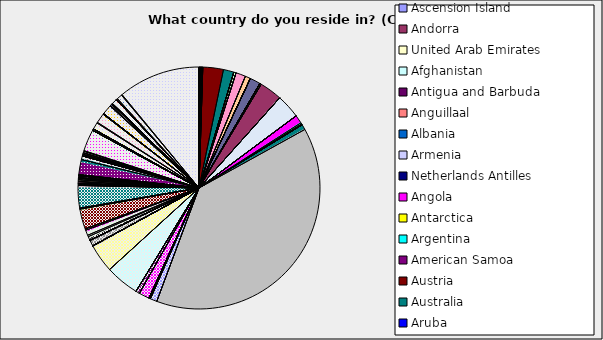
| Category | Series 0 |
|---|---|
| Ascension Island | 0 |
| Andorra | 0 |
| United Arab Emirates | 0 |
| Afghanistan | 0 |
| Antigua and Barbuda | 0 |
| Anguillaal | 0 |
| Albania | 0.001 |
| Armenia | 0 |
| Netherlands Antilles | 0 |
| Angola | 0 |
| Antarctica | 0 |
| Argentina | 0.003 |
| American Samoa | 0 |
| Austria | 0.028 |
| Australia | 0.014 |
| Aruba | 0 |
| Aland Islands | 0 |
| Azerbaijan | 0 |
| Bosnia and Herzegovina | 0.003 |
| Barbados | 0 |
| Bangladesh | 0 |
| Belgium | 0.013 |
| Burkina Faso | 0 |
| Bulgaria | 0.007 |
| Bahrain | 0 |
| Burundi | 0 |
| Benin | 0 |
| Bermuda | 0 |
| Brunei Darussalam | 0 |
| Bolivia | 0 |
| Brazil | 0.014 |
| Bahamas | 0 |
| Bhutan | 0 |
| Bouvet Island | 0 |
| Botswana | 0 |
| Belarus | 0.002 |
| Belize | 0 |
| Canada | 0.03 |
| Cocos (Keeling) Islands | 0 |
| Central African Republic | 0 |
| Congo | 0 |
| Switzerland | 0.032 |
| Cote d'Ivoire | 0 |
| Cook Islands | 0 |
| Chile | 0 |
| Cameroon | 0 |
| China | 0.011 |
| Colombia | 0.002 |
| Costa Rica | 0 |
| Cuba | 0.001 |
| Cape Verde | 0 |
| Christmas Island | 0 |
| Cyprus | 0 |
| Czech Republic | 0.007 |
| Germany | 0.386 |
| Djibouti | 0 |
| Denmark | 0.009 |
| Dominica | 0 |
| Dominican Republic | 0 |
| Algeria | 0.001 |
| Ecuador | 0 |
| Estonia | 0.001 |
| Egypt | 0 |
| Western Sahara | 0 |
| Eritrea | 0 |
| Spain | 0.014 |
| Ethiopia | 0 |
| European Union | 0 |
| Finland | 0.005 |
| Fiji | 0 |
| Falkland Islands (Malvinas) | 0 |
| Micronesia | 0 |
| Faroe Islands | 0 |
| France | 0.045 |
| Gabon | 0 |
| United Kingdom | 0.038 |
| Grenada | 0 |
| Georgia | 0 |
| French Guiana | 0 |
| Guernsey | 0 |
| Ghana | 0 |
| Gibraltar | 0 |
| Greenland | 0 |
| Gambia | 0 |
| Guinea | 0 |
| Guadeloupe | 0 |
| Equatorial Guinea | 0 |
| Greece | 0.008 |
| South Georgia and the South Sandwich Islands | 0 |
| Guatemala | 0 |
| Guam | 0 |
| Guinea-Bissau | 0 |
| Guyana | 0 |
| Hong Kong | 0 |
| Heard and McDonald Islands | 0 |
| Honduras | 0 |
| Croatia/Hrvatska | 0 |
| Haiti | 0 |
| Hungary | 0.005 |
| Indonesia | 0.002 |
| Ireland | 0.007 |
| Israel | 0.002 |
| Isle of Man | 0 |
| India | 0.027 |
| British Indian Ocean Territory | 0 |
| Iraq | 0 |
| Iran | 0.001 |
| Iceland | 0 |
| Italy | 0.03 |
| Jersey | 0 |
| Jamaica | 0.001 |
| Jordan | 0 |
| Japan | 0.001 |
| Kenya | 0 |
| Kyrgyzstan | 0 |
| Cambodia | 0 |
| Kiribati | 0 |
| Comoros | 0 |
| Saint Kitts and Nevis | 0 |
| Korea | 0 |
| Kuwait | 0 |
| Cayman Islands | 0 |
| Kazakhstan | 0 |
| Lao People's Democratic Republic | 0 |
| Lebanon | 0 |
| Saint Lucia | 0 |
| Liechtenstein | 0 |
| Sri Lanka | 0 |
| Liberia | 0 |
| Lesotho | 0 |
| Lithuania | 0.002 |
| Luxembourg | 0.001 |
| Latvia | 0.002 |
| Libyan Arab Jamahiriya | 0 |
| Morocco | 0.002 |
| Monaco | 0 |
| Moldova | 0 |
| Montenegro | 0 |
| Madagascar | 0 |
| Marshall Islands | 0 |
| Macedonia | 0 |
| Mali | 0 |
| Myanmar | 0 |
| Mongolia | 0 |
| Macao | 0 |
| Northern Mariana Islands | 0 |
| Martinique | 0 |
| Mauritania | 0 |
| Montserrat | 0 |
| Malta | 0 |
| Mauritius | 0 |
| Maldives | 0 |
| Malawi | 0 |
| Mexico | 0.002 |
| Malaysia | 0.001 |
| Mozambique | 0 |
| Namibia | 0 |
| New Caledonia | 0 |
| Niger | 0 |
| Norfolk Island | 0 |
| Nigeria | 0.001 |
| Nicaragua | 0 |
| Netherlands | 0.02 |
| Norway | 0.005 |
| Nepal | 0 |
| Nauru | 0 |
| Niue | 0 |
| New Zealand | 0.002 |
| Oman | 0 |
| Panama | 0 |
| Peru | 0.002 |
| French Polynesia | 0 |
| Papua New Guinea | 0 |
| Philippines | 0.002 |
| Pakistan | 0.001 |
| Poland | 0.029 |
| Saint Pierre and Miquelon | 0 |
| Pitcairn Island | 0 |
| Puerto Rico | 0 |
| Palestinian Territory | 0 |
| Portugal | 0.002 |
| Palau | 0 |
| Paraguay | 0 |
| Qatar | 0 |
| Reunion Island | 0 |
| Romania | 0.009 |
| Serbia | 0.001 |
| Russian Federation | 0.013 |
| Rwanda | 0 |
| Saudi Arabia | 0.001 |
| Solomon Islands | 0 |
| Seychelles | 0 |
| Sudan | 0 |
| Sweden | 0.013 |
| Singapore | 0.001 |
| Saint Helena | 0 |
| Slovenia | 0.002 |
| Svalbard and Jan Mayen Islands | 0 |
| Slovak Republic | 0.001 |
| Sierra Leone | 0 |
| San Marino | 0 |
| Senegal | 0 |
| Somalia | 0 |
| Suriname | 0 |
| Sao Tome and Principe | 0 |
| Soviet Union | 0 |
| El Salvador | 0 |
| Syrian Arab Republic | 0 |
| Swaziland | 0 |
| Turks and Caicos Islands | 0 |
| Chad | 0 |
| French Southern Territories | 0 |
| Togo | 0 |
| Thailand | 0 |
| Tajikistan | 0 |
| Tokelau | 0 |
| Timor-Leste | 0 |
| Turkmenistan | 0 |
| Tunisia | 0 |
| Tonga | 0 |
| East Timor | 0 |
| Turkey | 0.007 |
| Trinidad and Tobago | 0 |
| Tuvalu | 0 |
| Taiwan | 0.001 |
| Tanzania | 0.001 |
| Ukraine | 0.007 |
| Uganda | 0.001 |
| United States | 0.111 |
| Uruguay | 0.001 |
| Uzbekistan | 0 |
| Holy See (Vatican City State) | 0 |
| Saint Vincent and the Grenadines | 0 |
| Venezuela | 0.001 |
| Virgin Islands, British | 0 |
| Virgin Islands, U.S. | 0 |
| Vietnam | 0 |
| Vanuatu | 0 |
| Wallis and Futuna Islands | 0 |
| Samoa | 0 |
| Yemen | 0 |
| Mayotte | 0 |
| Yugoslavia | 0 |
| South Africa | 0.001 |
| Zambia | 0 |
| Zimbabwe | 0 |